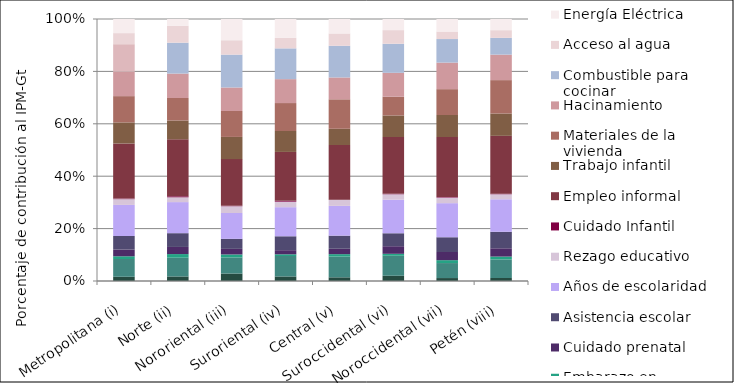
| Category | Acceso a servicios de salud | Seguridad alim. y nutr. | Embarazo en adolescentes | Cuidado prenatal | Asistencia escolar | Años de escolaridad | Rezago educativo | Cuidado Infantil | Empleo informal | Trabajo infantil | Materiales de la vivienda | Hacinamiento | Combustible para cocinar | Acceso al agua | Energía Eléctrica |
|---|---|---|---|---|---|---|---|---|---|---|---|---|---|---|---|
| Metropolitana (i) | 1.347 | 5.678 | 0.867 | 2.15 | 4.329 | 9.934 | 1.839 | 0.177 | 17.614 | 6.723 | 8.4 | 7.803 | 8.785 | 3.537 | 4.512 |
| Norte (ii) | 1.535 | 6.333 | 1.229 | 2.403 | 4.652 | 10.491 | 1.626 | 0.338 | 19.254 | 6.344 | 7.607 | 8.244 | 10.431 | 5.701 | 2.298 |
| Nororiental (iii) | 2.4 | 5.202 | 0.957 | 1.804 | 3.231 | 8.338 | 2.186 | 0.132 | 15.061 | 7.158 | 8.363 | 7.587 | 10.599 | 4.637 | 6.849 |
| Suroriental (iv) | 1.474 | 6.613 | 0.552 | 1.342 | 4.503 | 9.418 | 1.792 | 0.281 | 15.821 | 6.779 | 9.05 | 7.743 | 9.964 | 3.401 | 6.11 |
| Central (v) | 1.186 | 6.686 | 0.778 | 1.735 | 4.229 | 9.591 | 1.909 | 0.055 | 17.643 | 5.23 | 9.502 | 7.037 | 10.206 | 3.971 | 4.657 |
| Suroccidental (vi) | 1.689 | 6.465 | 0.629 | 2.456 | 4.182 | 10.849 | 1.747 | 0.145 | 18.348 | 6.956 | 6.046 | 7.731 | 9.378 | 4.41 | 3.591 |
| Noroccidental (vii) | 0.918 | 4.669 | 0.896 | 2.541 | 4.598 | 10.61 | 1.717 | 0.168 | 18.711 | 6.852 | 8.045 | 8.267 | 7.335 | 2.33 | 3.909 |
| Petén (viii) | 0.94 | 5.85 | 0.917 | 2.614 | 5.197 | 10.263 | 1.588 | 0.171 | 18.256 | 7.033 | 10.544 | 8.044 | 5.288 | 2.423 | 3.527 |